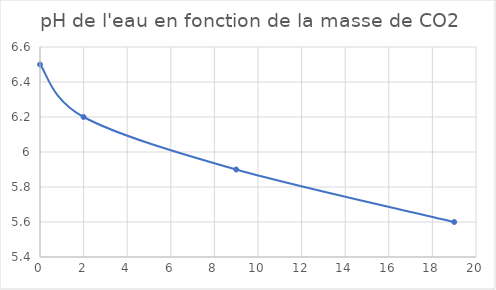
| Category | Series 0 |
|---|---|
| 0.0 | 6.5 |
| 2.0 | 6.2 |
| 9.0 | 5.9 |
| 19.0 | 5.6 |